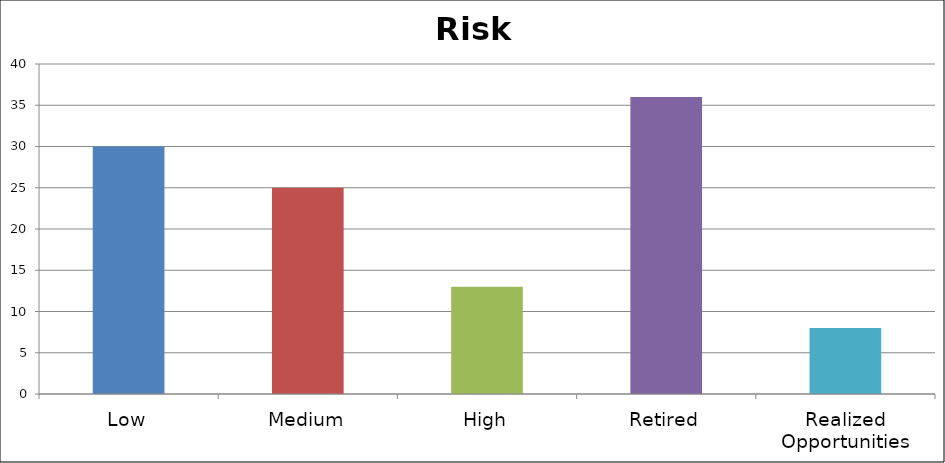
| Category | Series 0 |
|---|---|
| Low | 30 |
| Medium | 25 |
| High | 13 |
| Retired | 36 |
| Realized Opportunities | 8 |